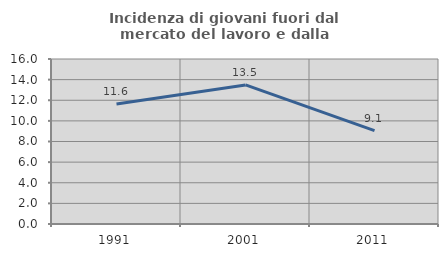
| Category | Incidenza di giovani fuori dal mercato del lavoro e dalla formazione  |
|---|---|
| 1991.0 | 11.637 |
| 2001.0 | 13.487 |
| 2011.0 | 9.053 |